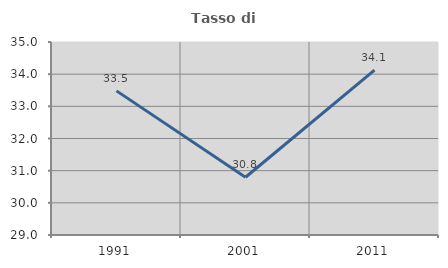
| Category | Tasso di occupazione   |
|---|---|
| 1991.0 | 33.481 |
| 2001.0 | 30.795 |
| 2011.0 | 34.127 |